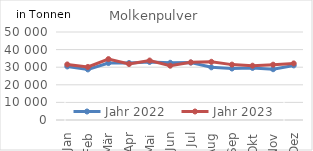
| Category | Jahr 2022 | Jahr 2023 |
|---|---|---|
| Jan | 30420.21 | 31561.433 |
| Feb | 28741.791 | 30135.806 |
| Mär | 32355.762 | 34605.137 |
| Apr | 32375.318 | 31813.656 |
| Mai | 32980.09 | 33791.881 |
| Jun | 32509.616 | 30844.23 |
| Jul | 32614.776 | 32752.03 |
| Aug | 29928.048 | 33066.239 |
| Sep | 29251.161 | 31469.941 |
| Okt | 29580.829 | 30852.441 |
| Nov | 28856.292 | 31422.586 |
| Dez | 31019.884 | 32144.08 |